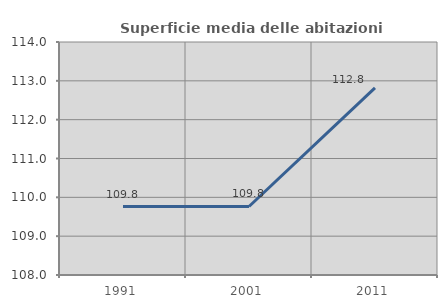
| Category | Superficie media delle abitazioni occupate |
|---|---|
| 1991.0 | 109.762 |
| 2001.0 | 109.765 |
| 2011.0 | 112.819 |